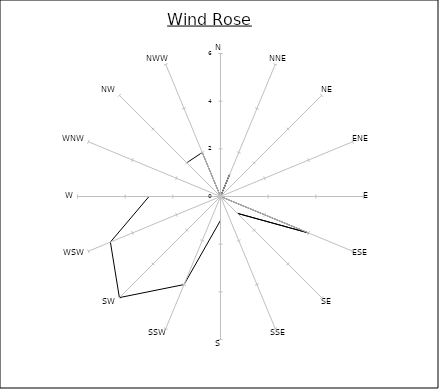
| Category | Series 0 |
|---|---|
| N | 0 |
| NNE | 1 |
| NE | 0 |
| ENE | 0 |
| E | 0 |
| ESE | 4 |
| SE | 1 |
| SSE | 0 |
| S | 1 |
| SSW | 4 |
| SW | 6 |
| WSW | 5 |
| W | 3 |
| WNW | 0 |
| NW | 2 |
| NWW | 2 |